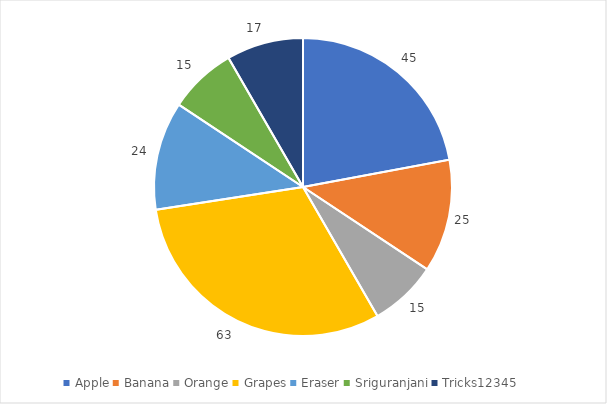
| Category | Item |
|---|---|
| Apple | 45 |
| Banana | 25 |
| Orange | 15 |
| Grapes | 63 |
| Eraser | 24 |
| Sriguranjani | 15 |
| Tricks12345 | 17 |